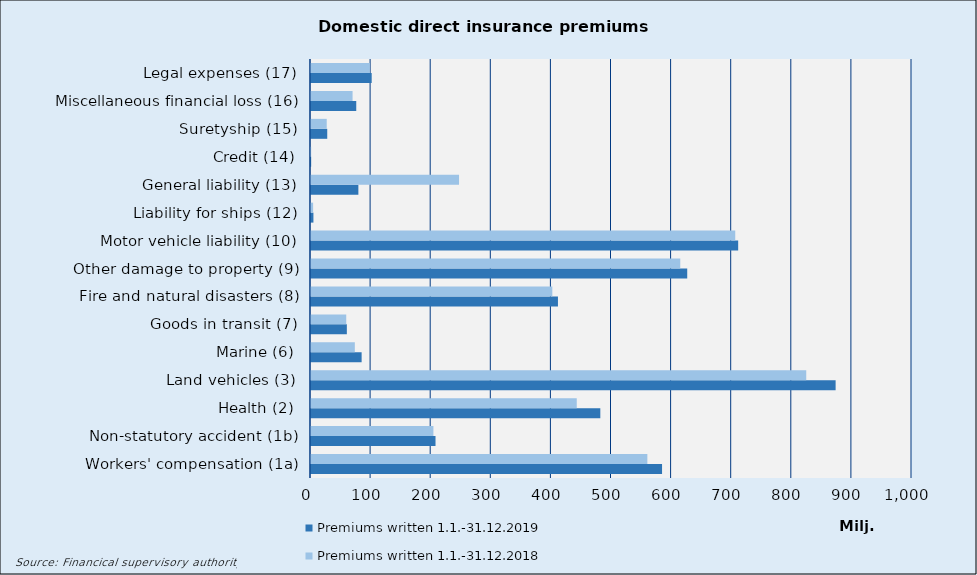
| Category | Premiums written |
|---|---|
| Workers' compensation (1a) | 559666.145 |
| Non-statutory accident (1b) | 203677.443 |
| Health (2) | 442195.381 |
| Land vehicles (3) | 824036.139 |
| Marine (6) | 72920.45 |
| Goods in transit (7) | 58636.91 |
| Fire and natural disasters (8) | 401537.64 |
| Other damage to property (9) | 614407.024 |
| Motor vehicle liability (10) | 705892.408 |
| Liability for ships (12) | 3514.723 |
| General liability (13) | 246323.511 |
| Credit (14) | 263.968 |
| Suretyship (15) | 26170.212 |
| Miscellaneous financial loss (16) | 69180.597 |
| Legal expenses (17) | 97911.11 |